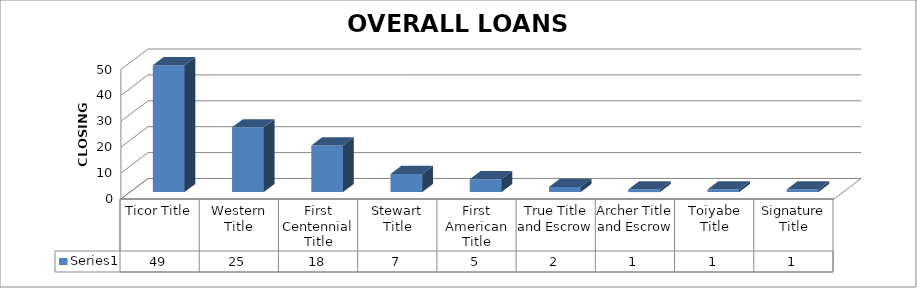
| Category | Series 0 |
|---|---|
| Ticor Title | 49 |
| Western Title | 25 |
| First Centennial Title | 18 |
| Stewart Title | 7 |
| First American Title | 5 |
| True Title and Escrow | 2 |
| Archer Title and Escrow | 1 |
| Toiyabe Title | 1 |
| Signature Title | 1 |